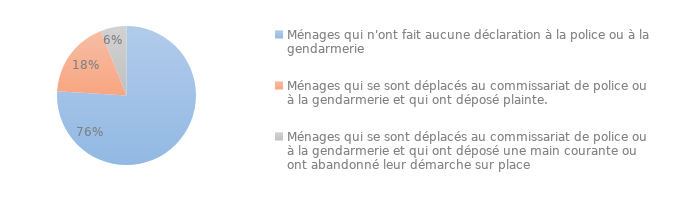
| Category | Series 0 |
|---|---|
| Ménages qui n'ont fait aucune déclaration à la police ou à la gendarmerie | 0.76 |
| Ménages qui se sont déplacés au commissariat de police ou à la gendarmerie et qui ont déposé plainte. | 0.18 |
| Ménages qui se sont déplacés au commissariat de police ou à la gendarmerie et qui ont déposé une main courante ou ont abandonné leur démarche sur place | 0.06 |